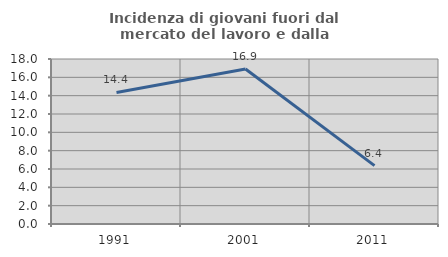
| Category | Incidenza di giovani fuori dal mercato del lavoro e dalla formazione  |
|---|---|
| 1991.0 | 14.355 |
| 2001.0 | 16.908 |
| 2011.0 | 6.364 |